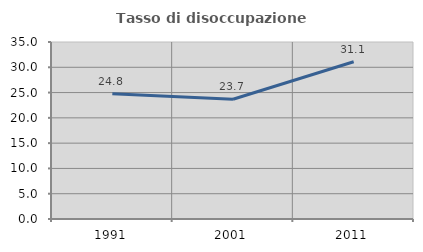
| Category | Tasso di disoccupazione giovanile  |
|---|---|
| 1991.0 | 24.769 |
| 2001.0 | 23.675 |
| 2011.0 | 31.091 |